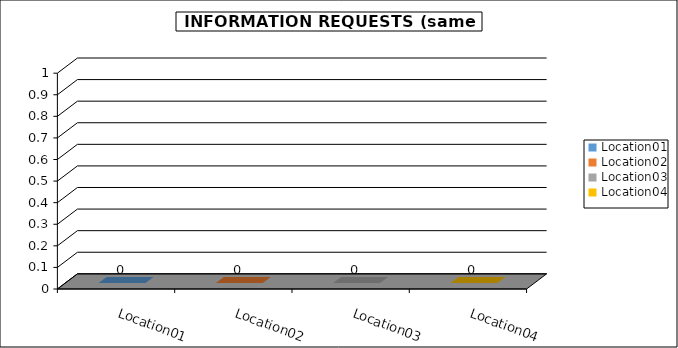
| Category | Data A |
|---|---|
| Location01 | 0 |
| Location02 | 0 |
| Location03 | 0 |
| Location04 | 0 |